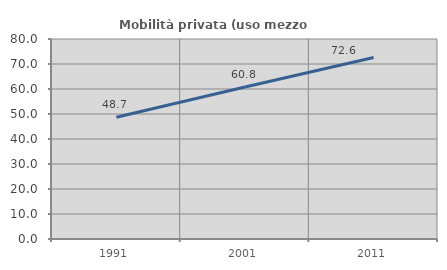
| Category | Mobilità privata (uso mezzo privato) |
|---|---|
| 1991.0 | 48.696 |
| 2001.0 | 60.768 |
| 2011.0 | 72.626 |